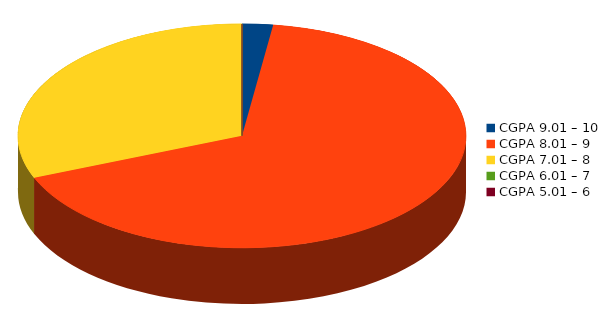
| Category | Number of students |
|---|---|
| CGPA 9.01 – 10 | 1 |
| CGPA 8.01 – 9 | 30 |
| CGPA 7.01 – 8 | 14 |
| CGPA 6.01 – 7 | 0 |
| CGPA 5.01 – 6 | 0 |